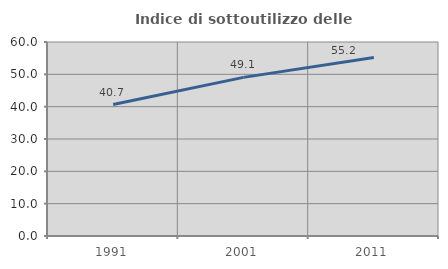
| Category | Indice di sottoutilizzo delle abitazioni  |
|---|---|
| 1991.0 | 40.656 |
| 2001.0 | 49.057 |
| 2011.0 | 55.183 |